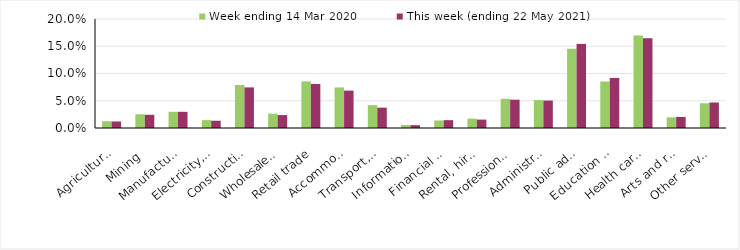
| Category | Week ending 14 Mar 2020 | This week (ending 22 May 2021) |
|---|---|---|
| Agriculture, forestry and fishing | 0.012 | 0.012 |
| Mining | 0.025 | 0.024 |
| Manufacturing | 0.03 | 0.03 |
| Electricity, gas, water and waste services | 0.014 | 0.013 |
| Construction | 0.079 | 0.074 |
| Wholesale trade | 0.026 | 0.024 |
| Retail trade | 0.086 | 0.081 |
| Accommodation and food services | 0.074 | 0.069 |
| Transport, postal and warehousing | 0.042 | 0.037 |
| Information media and telecommunications | 0.006 | 0.005 |
| Financial and insurance services | 0.014 | 0.014 |
| Rental, hiring and real estate services | 0.017 | 0.015 |
| Professional, scientific and technical services | 0.054 | 0.052 |
| Administrative and support services | 0.051 | 0.05 |
| Public administration and safety | 0.145 | 0.154 |
| Education and training | 0.085 | 0.092 |
| Health care and social assistance | 0.17 | 0.165 |
| Arts and recreation services | 0.02 | 0.02 |
| Other services | 0.045 | 0.047 |